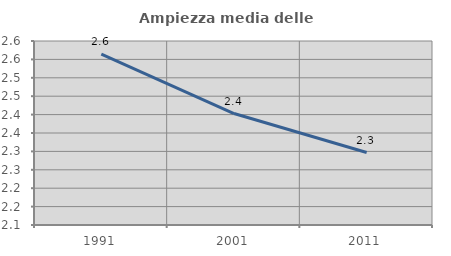
| Category | Ampiezza media delle famiglie |
|---|---|
| 1991.0 | 2.564 |
| 2001.0 | 2.403 |
| 2011.0 | 2.297 |